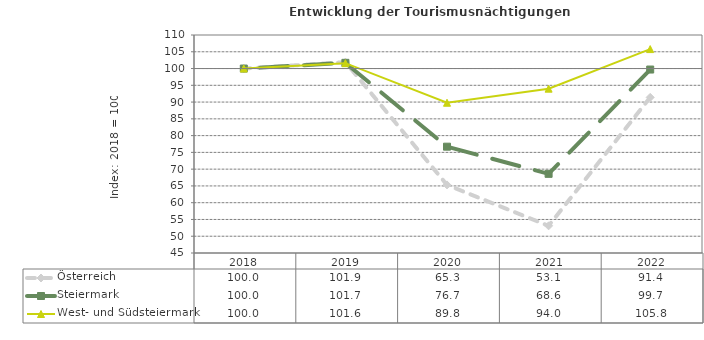
| Category | Österreich | Steiermark | West- und Südsteiermark |
|---|---|---|---|
| 2022.0 | 91.4 | 99.7 | 105.8 |
| 2021.0 | 53.1 | 68.6 | 94 |
| 2020.0 | 65.3 | 76.7 | 89.8 |
| 2019.0 | 101.9 | 101.7 | 101.6 |
| 2018.0 | 100 | 100 | 100 |